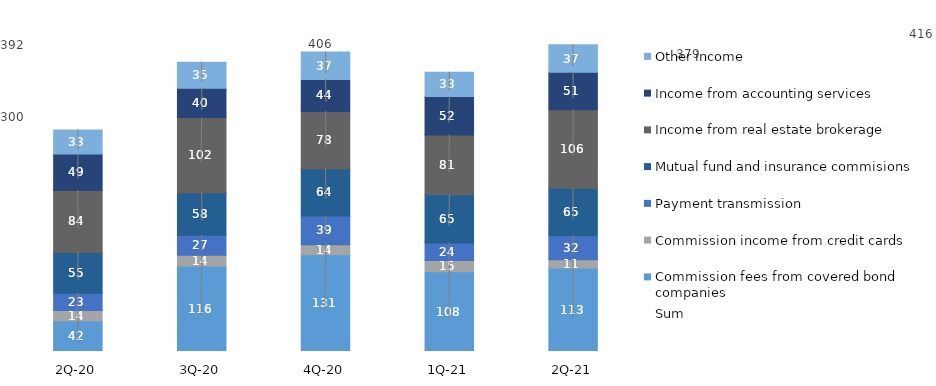
| Category | Commission fees from covered bond companies | Commission income from credit cards | Payment transmission | Mutual fund and insurance commisions | Income from real estate brokerage | Income from accounting services | Other income |
|---|---|---|---|---|---|---|---|
| 2Q-21 | 113.288 | 11.051 | 32.388 | 64.605 | 106.238 | 50.876 | 37.171 |
| 1Q-21 | 107.955 | 15.25 | 23.942 | 65.464 | 80.888 | 52.216 | 32.873 |
| 4Q-20 | 131.015 | 13.687 | 38.872 | 64.05 | 77.589 | 43.624 | 37.225 |
| 3Q-20 | 116.034 | 14.295 | 27.183 | 57.628 | 101.952 | 39.804 | 35.242 |
| 2Q-20 | 41.55 | 14.097 | 23.262 | 55.386 | 84.016 | 49.478 | 32.501 |